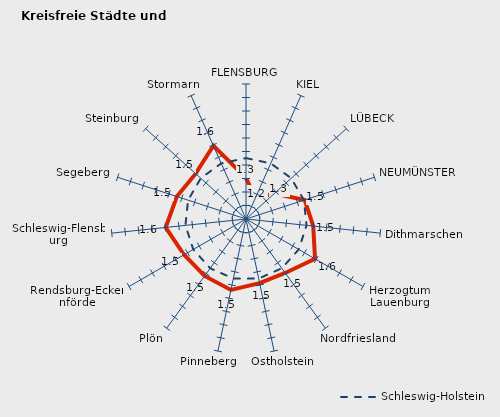
| Category | Kreise | Schleswig-Holstein |
|---|---|---|
| FLENSBURG | 1.303 | 1.451 |
| KIEL | 1.173 | 1.451 |
| LÜBECK | 1.282 | 1.451 |
| NEUMÜNSTER | 1.457 | 1.451 |
| Dithmarschen | 1.501 | 1.451 |
| Herzogtum Lauenburg | 1.59 | 1.451 |
| Nordfriesland | 1.494 | 1.451 |
| Ostholstein | 1.485 | 1.451 |
| Pinneberg | 1.538 | 1.451 |
| Plön | 1.522 | 1.451 |
| Rendsburg-Eckernförde | 1.53 | 1.451 |
| Schleswig-Flensburg | 1.599 | 1.451 |
| Segeberg | 1.539 | 1.451 |
| Steinburg | 1.502 | 1.451 |
| Stormarn | 1.594 | 1.451 |